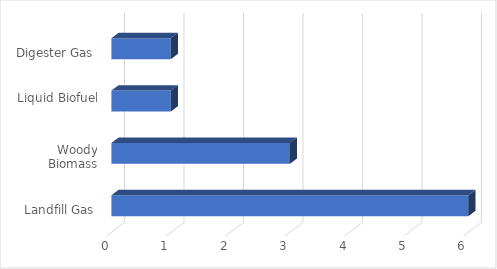
| Category | Series 0 |
|---|---|
| Landfill Gas | 6 |
| Woody Biomass | 3 |
| Liquid Biofuel | 1 |
| Digester Gas | 1 |